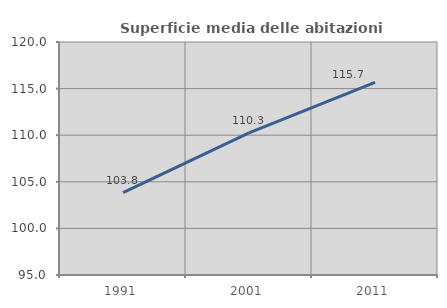
| Category | Superficie media delle abitazioni occupate |
|---|---|
| 1991.0 | 103.848 |
| 2001.0 | 110.26 |
| 2011.0 | 115.656 |